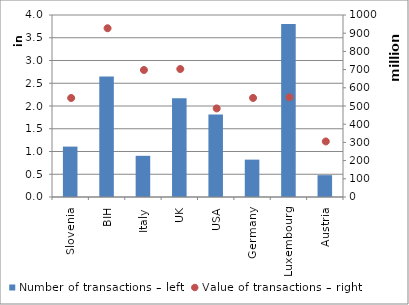
| Category | Number of transactions – left |
|---|---|
| Slovenia | 1107783 |
| BIH | 2646924 |
| Italy | 904885 |
| UK | 2171117 |
| USA | 1815017 |
| Germany | 821262 |
| Luxembourg | 3804361 |
| Austria | 479857 |